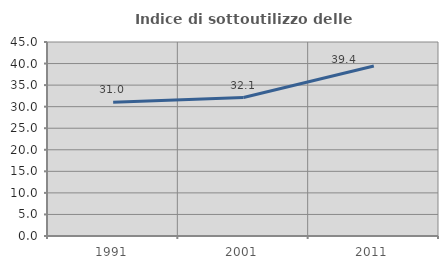
| Category | Indice di sottoutilizzo delle abitazioni  |
|---|---|
| 1991.0 | 31.014 |
| 2001.0 | 32.11 |
| 2011.0 | 39.429 |